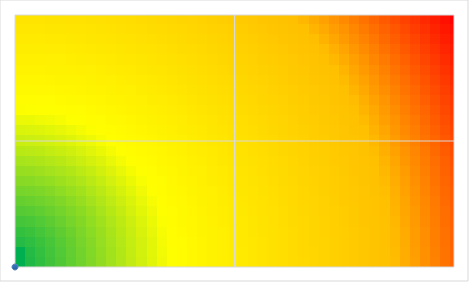
| Category | Risk |
|---|---|
| 0.0 | 0 |